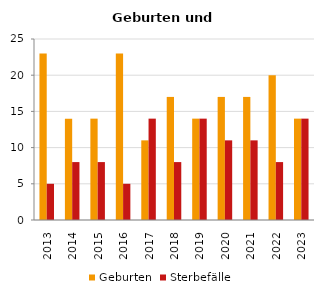
| Category | Geburten | Sterbefälle |
|---|---|---|
| 2013.0 | 23 | 5 |
| 2014.0 | 14 | 8 |
| 2015.0 | 14 | 8 |
| 2016.0 | 23 | 5 |
| 2017.0 | 11 | 14 |
| 2018.0 | 17 | 8 |
| 2019.0 | 14 | 14 |
| 2020.0 | 17 | 11 |
| 2021.0 | 17 | 11 |
| 2022.0 | 20 | 8 |
| 2023.0 | 14 | 14 |